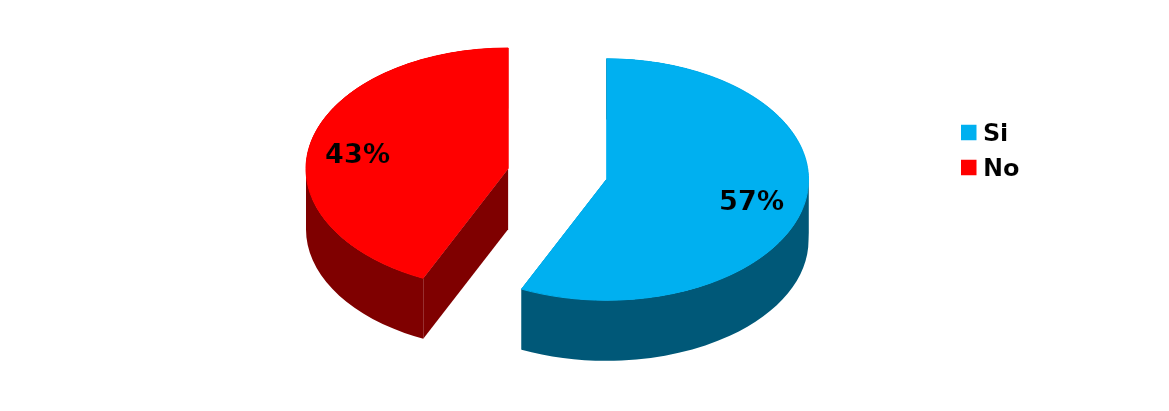
| Category | Series 0 |
|---|---|
| Si | 33 |
| No | 25 |